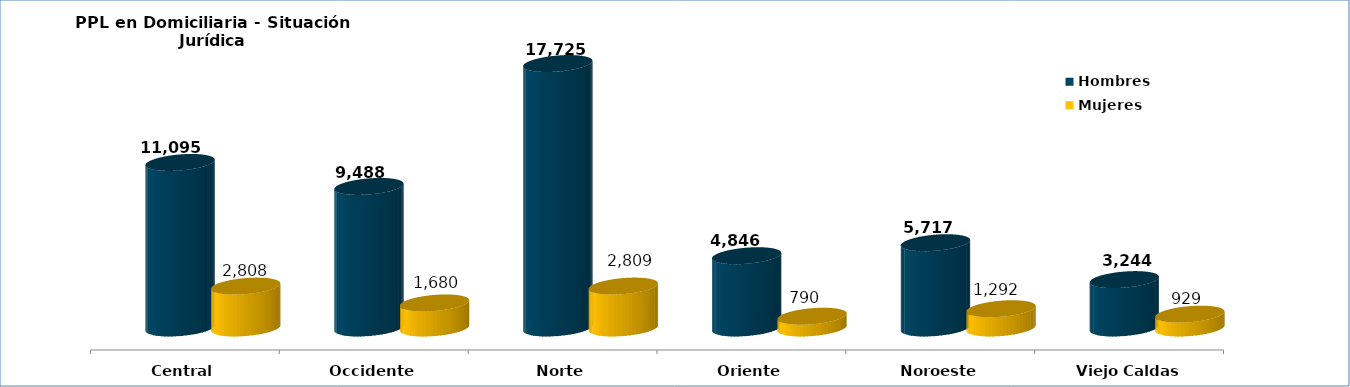
| Category | Hombres | Mujeres |
|---|---|---|
| Central | 11095 | 2808 |
| Occidente | 9488 | 1680 |
| Norte | 17725 | 2809 |
| Oriente | 4846 | 790 |
| Noroeste | 5717 | 1292 |
| Viejo Caldas | 3244 | 929 |